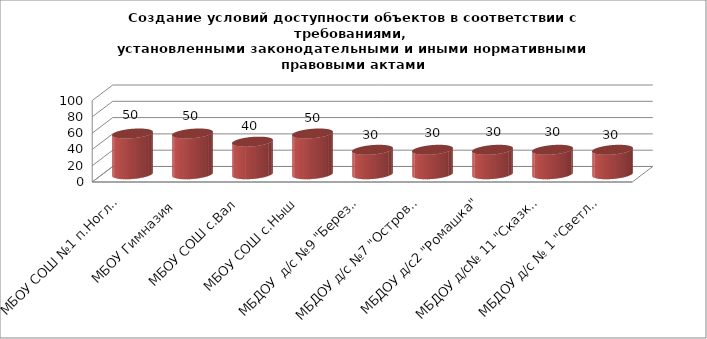
| Category | Series 1 |
|---|---|
| МБОУ СОШ №1 п.Ноглики | 50 |
| МБОУ Гимназия  | 50 |
| МБОУ СОШ с.Вал | 40 |
| МБОУ СОШ с.Ныш | 50 |
| МБДОУ  д/с №9 "Березка" | 30 |
| МБДОУ д/с №7 "Островок" | 30 |
| МБДОУ д/с2 "Ромашка" | 30 |
| МБДОУ д/с№ 11 "Сказка" | 30 |
| МБДОУ д/с № 1 "Светлячок " | 30 |